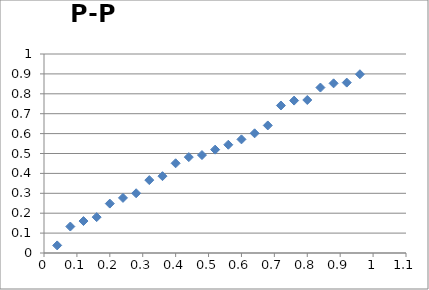
| Category | Series 0 |
|---|---|
| 0.04 | 0.038 |
| 0.08 | 0.133 |
| 0.12 | 0.161 |
| 0.16 | 0.18 |
| 0.2 | 0.248 |
| 0.24 | 0.277 |
| 0.28 | 0.3 |
| 0.32 | 0.366 |
| 0.36 | 0.386 |
| 0.4 | 0.451 |
| 0.44 | 0.482 |
| 0.48 | 0.492 |
| 0.52 | 0.519 |
| 0.56 | 0.544 |
| 0.6 | 0.571 |
| 0.64 | 0.601 |
| 0.68 | 0.641 |
| 0.72 | 0.741 |
| 0.76 | 0.766 |
| 0.8 | 0.769 |
| 0.84 | 0.831 |
| 0.88 | 0.853 |
| 0.92 | 0.856 |
| 0.96 | 0.898 |